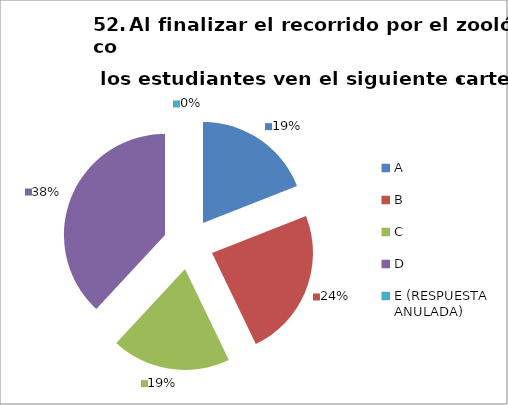
| Category | CANTIDAD DE RESPUESTAS PREGUNTA (52) | PORCENTAJE |
|---|---|---|
| A | 4 | 0.19 |
| B | 5 | 0.238 |
| C | 4 | 0.19 |
| D | 8 | 0.381 |
| E (RESPUESTA ANULADA) | 0 | 0 |